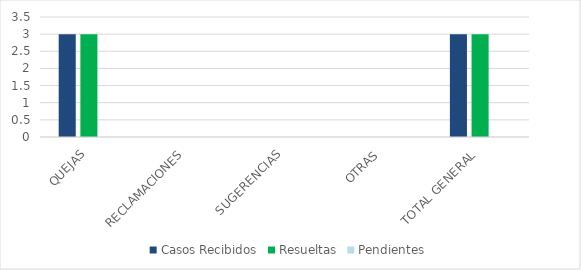
| Category | Casos Recibidos | Resueltas | Pendientes |
|---|---|---|---|
| QUEJAS | 3 | 3 | 0 |
| RECLAMACIONES | 0 | 0 | 0 |
| SUGERENCIAS | 0 | 0 | 0 |
| OTRAS | 0 | 0 | 0 |
| TOTAL GENERAL | 3 | 3 | 0 |